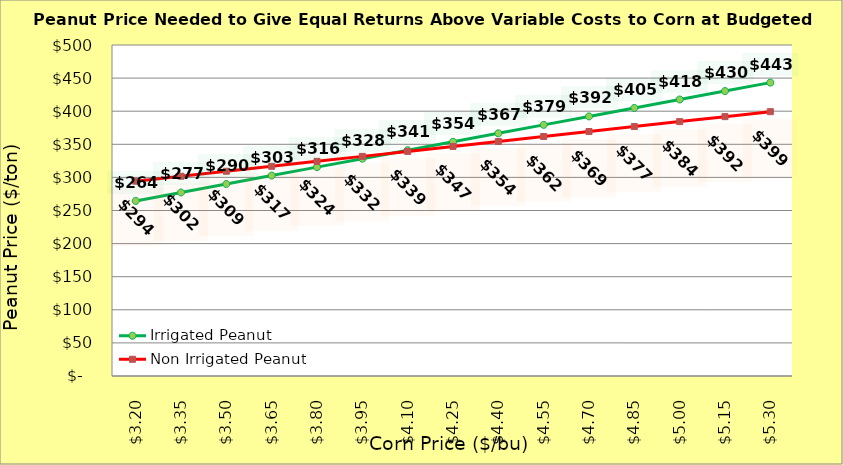
| Category | Irrigated Peanut | Non Irrigated Peanut |
|---|---|---|
| 3.2 | 264.468 | 294.271 |
| 3.35 | 277.234 | 301.771 |
| 3.5 | 290 | 309.271 |
| 3.65 | 302.766 | 316.771 |
| 3.8 | 315.532 | 324.271 |
| 3.9499999999999997 | 328.298 | 331.771 |
| 4.1 | 341.064 | 339.271 |
| 4.25 | 353.83 | 346.771 |
| 4.4 | 366.596 | 354.271 |
| 4.550000000000001 | 379.362 | 361.771 |
| 4.700000000000001 | 392.128 | 369.271 |
| 4.850000000000001 | 404.894 | 376.771 |
| 5.000000000000002 | 417.66 | 384.271 |
| 5.150000000000002 | 430.426 | 391.771 |
| 5.3000000000000025 | 443.192 | 399.271 |